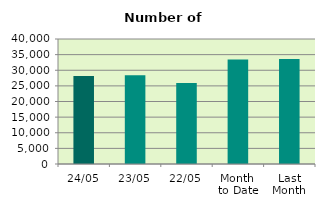
| Category | Series 0 |
|---|---|
| 24/05 | 28134 |
| 23/05 | 28388 |
| 22/05 | 25958 |
| Month 
to Date | 33418.824 |
| Last
Month | 33588.111 |